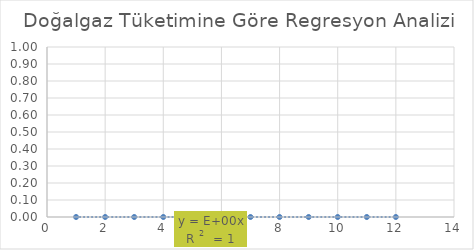
| Category | Series 0 |
|---|---|
| 0.0 | 0 |
| 0.0 | 0 |
| 0.0 | 0 |
| 0.0 | 0 |
| 0.0 | 0 |
| 0.0 | 0 |
| 0.0 | 0 |
| 0.0 | 0 |
| 0.0 | 0 |
| 0.0 | 0 |
| 0.0 | 0 |
| 0.0 | 0 |